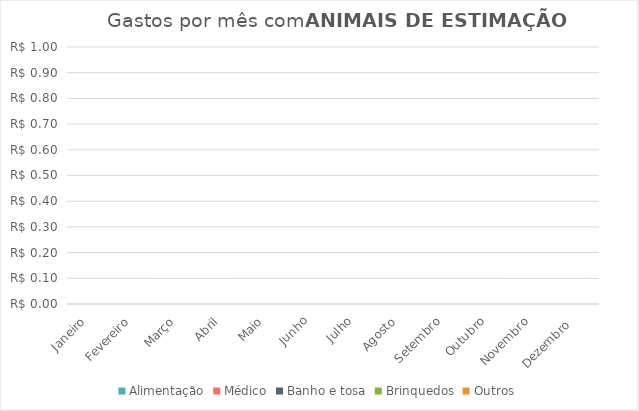
| Category | Alimentação | Médico | Banho e tosa | Brinquedos | Outros |
|---|---|---|---|---|---|
| Janeiro | 0 | 0 | 0 | 0 | 0 |
| Fevereiro | 0 | 0 | 0 | 0 | 0 |
| Março | 0 | 0 | 0 | 0 | 0 |
| Abril | 0 | 0 | 0 | 0 | 0 |
| Maio | 0 | 0 | 0 | 0 | 0 |
| Junho | 0 | 0 | 0 | 0 | 0 |
| Julho | 0 | 0 | 0 | 0 | 0 |
| Agosto | 0 | 0 | 0 | 0 | 0 |
| Setembro | 0 | 0 | 0 | 0 | 0 |
| Outubro | 0 | 0 | 0 | 0 | 0 |
| Novembro | 0 | 0 | 0 | 0 | 0 |
| Dezembro  | 0 | 0 | 0 | 0 | 0 |